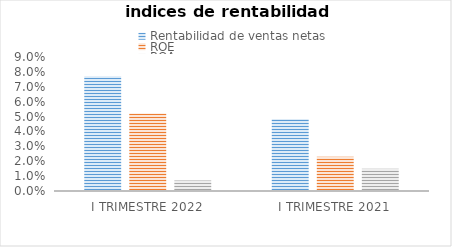
| Category | Rentabilidad de ventas netas | ROE | ROA |
|---|---|---|---|
| I TRIMESTRE 2022 | 0.077 | 0.052 | 0.007 |
| I TRIMESTRE 2021 | 0.048 | 0.023 | 0.015 |